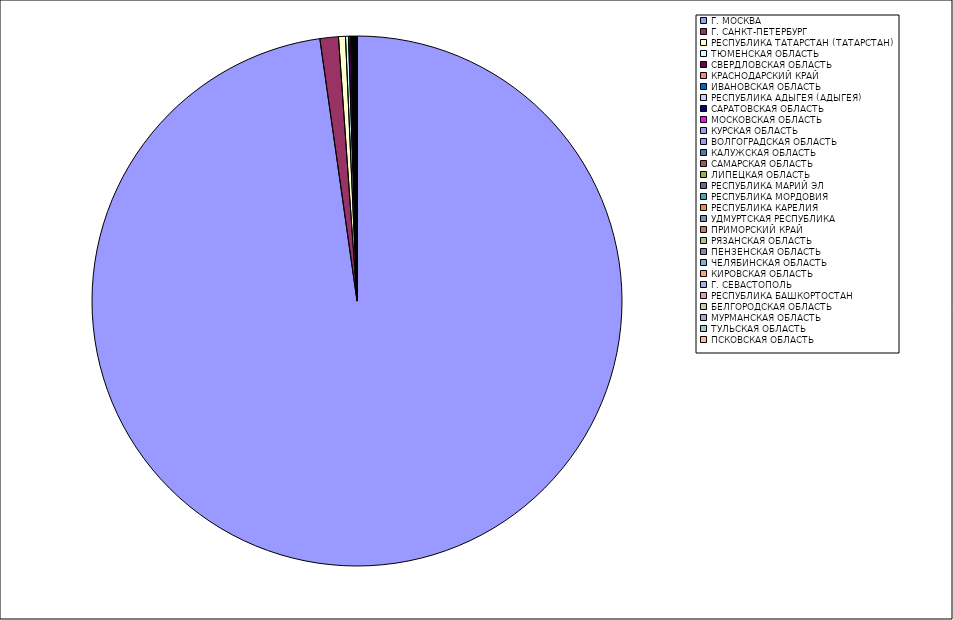
| Category | Оборот |
|---|---|
| Г. МОСКВА | 97.722 |
| Г. САНКТ-ПЕТЕРБУРГ | 1.126 |
| РЕСПУБЛИКА ТАТАРСТАН (ТАТАРСТАН) | 0.422 |
| ТЮМЕНСКАЯ ОБЛАСТЬ | 0.181 |
| СВЕРДЛОВСКАЯ ОБЛАСТЬ | 0.131 |
| КРАСНОДАРСКИЙ КРАЙ | 0.039 |
| ИВАНОВСКАЯ ОБЛАСТЬ | 0.037 |
| РЕСПУБЛИКА АДЫГЕЯ (АДЫГЕЯ) | 0.034 |
| САРАТОВСКАЯ ОБЛАСТЬ | 0.03 |
| МОСКОВСКАЯ ОБЛАСТЬ | 0.027 |
| КУРСКАЯ ОБЛАСТЬ | 0.021 |
| ВОЛГОГРАДСКАЯ ОБЛАСТЬ | 0.019 |
| КАЛУЖСКАЯ ОБЛАСТЬ | 0.016 |
| САМАРСКАЯ ОБЛАСТЬ | 0.016 |
| ЛИПЕЦКАЯ ОБЛАСТЬ | 0.014 |
| РЕСПУБЛИКА МАРИЙ ЭЛ | 0.012 |
| РЕСПУБЛИКА МОРДОВИЯ | 0.012 |
| РЕСПУБЛИКА КАРЕЛИЯ | 0.01 |
| УДМУРТСКАЯ РЕСПУБЛИКА | 0.01 |
| ПРИМОРСКИЙ КРАЙ | 0.01 |
| РЯЗАНСКАЯ ОБЛАСТЬ | 0.009 |
| ПЕНЗЕНСКАЯ ОБЛАСТЬ | 0.009 |
| ЧЕЛЯБИНСКАЯ ОБЛАСТЬ | 0.009 |
| КИРОВСКАЯ ОБЛАСТЬ | 0.009 |
| Г. СЕВАСТОПОЛЬ | 0.007 |
| РЕСПУБЛИКА БАШКОРТОСТАН | 0.007 |
| БЕЛГОРОДСКАЯ ОБЛАСТЬ | 0.007 |
| МУРМАНСКАЯ ОБЛАСТЬ | 0.006 |
| ТУЛЬСКАЯ ОБЛАСТЬ | 0.006 |
| ПСКОВСКАЯ ОБЛАСТЬ | 0.005 |